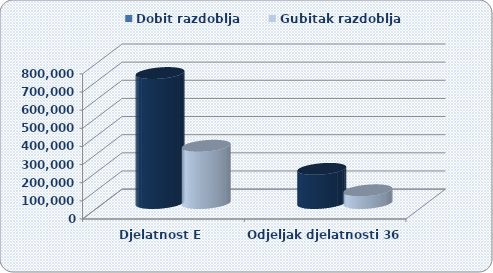
| Category | Dobit razdoblja  | Gubitak razdoblja  |
|---|---|---|
| Djelatnost E  | 716421.796 | 315387.222 |
| Odjeljak djelatnosti 36 | 188214.756 | 69965.531 |